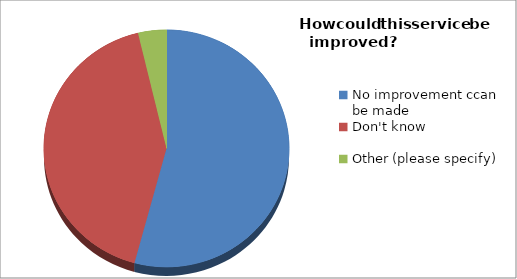
| Category | Series 0 |
|---|---|
| No improvement ccan be made | 58 |
| Don't know | 45 |
| Other (please specify) | 4 |